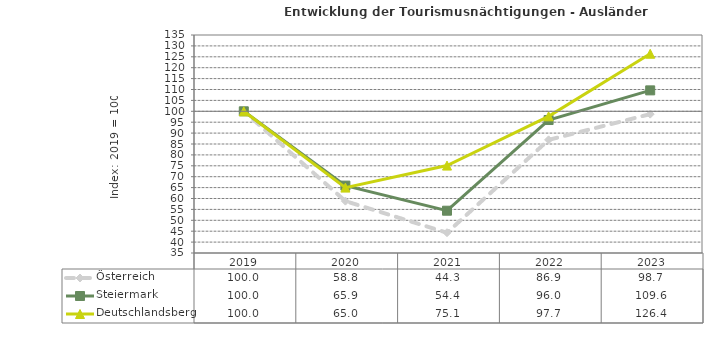
| Category | Österreich | Steiermark | Deutschlandsberg |
|---|---|---|---|
| 2023.0 | 98.7 | 109.6 | 126.4 |
| 2022.0 | 86.9 | 96 | 97.7 |
| 2021.0 | 44.3 | 54.4 | 75.1 |
| 2020.0 | 58.8 | 65.9 | 65 |
| 2019.0 | 100 | 100 | 100 |